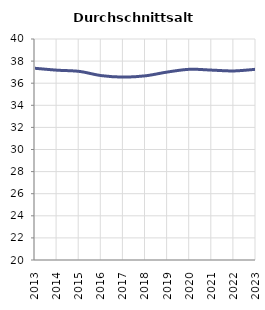
| Category | Durchschnittsalter |
|---|---|
| 2013.0 | 37.35 |
| 2014.0 | 37.178 |
| 2015.0 | 37.069 |
| 2016.0 | 36.687 |
| 2017.0 | 36.552 |
| 2018.0 | 36.669 |
| 2019.0 | 37.015 |
| 2020.0 | 37.26 |
| 2021.0 | 37.184 |
| 2022.0 | 37.11 |
| 2023.0 | 37.261 |